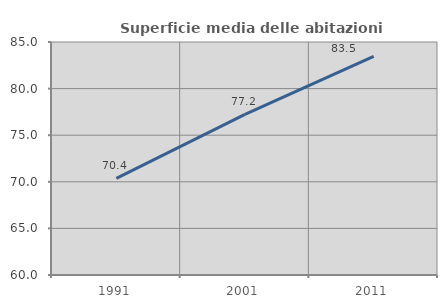
| Category | Superficie media delle abitazioni occupate |
|---|---|
| 1991.0 | 70.371 |
| 2001.0 | 77.225 |
| 2011.0 | 83.464 |